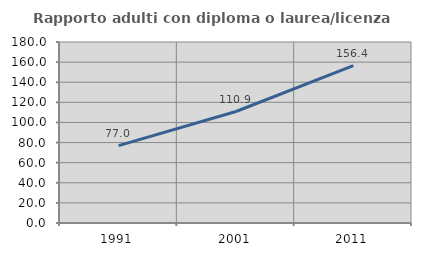
| Category | Rapporto adulti con diploma o laurea/licenza media  |
|---|---|
| 1991.0 | 76.98 |
| 2001.0 | 110.868 |
| 2011.0 | 156.414 |